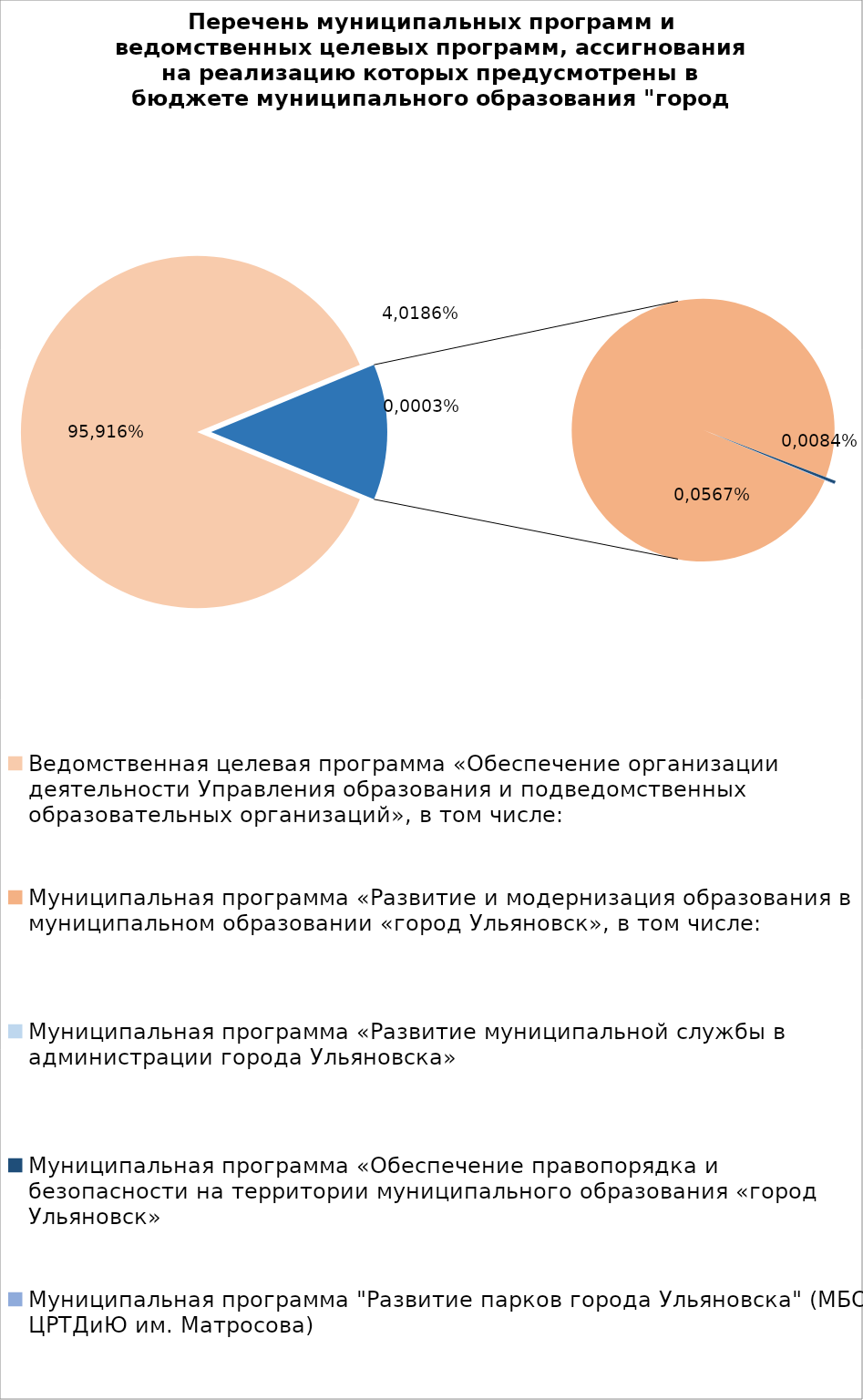
| Category | Series 0 |
|---|---|
| Ведомственная целевая программа «Обеспечение организации деятельности Управления образования и подведомственных образовательных организаций», в том числе: | 5191091.8 |
| Муниципальная программа «Развитие и модернизация образования в муниципальном образовании «город Ульяновск», в том числе: | 736528.4 |
| Муниципальная программа «Развитие муниципальной службы в администрации города Ульяновска» | 14.3 |
| Муниципальная программа «Обеспечение правопорядка и безопасности на территории муниципального образования «город Ульяновск» | 2700 |
| Муниципальная программа "Развитие парков города Ульяновска" (МБОУ ЦРТДиЮ им. Матросова) | 400 |